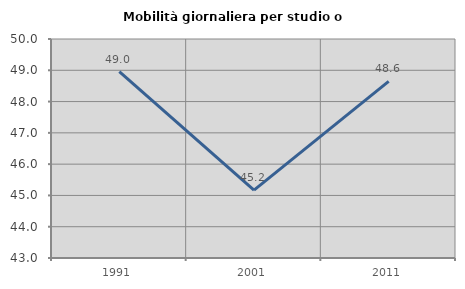
| Category | Mobilità giornaliera per studio o lavoro |
|---|---|
| 1991.0 | 48.961 |
| 2001.0 | 45.172 |
| 2011.0 | 48.644 |